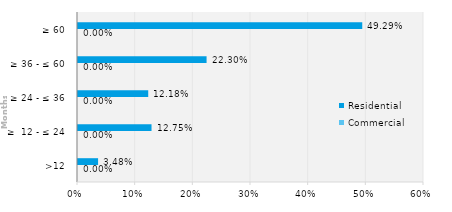
| Category | Commercial | Residential |
|---|---|---|
| >12 | 0 | 0.035 |
| ≥  12 - ≤ 24 | 0 | 0.128 |
| ≥ 24 - ≤ 36 | 0 | 0.122 |
| ≥ 36 - ≤ 60 | 0 | 0.223 |
| ≥ 60 | 0 | 0.493 |